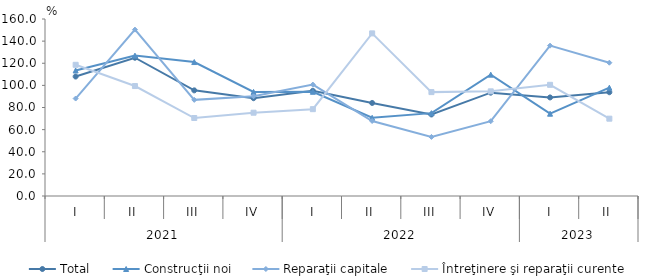
| Category | Total | Construcţii noi | Reparaţii capitale | Întreţinere şi reparaţii curente |
|---|---|---|---|---|
| 0 | 108 | 113.5 | 88.1 | 118.6 |
| 1 | 125 | 126.9 | 150.4 | 99.4 |
| 2 | 95.5 | 121.1 | 86.9 | 70.5 |
| 3 | 88.4 | 94.1 | 90.1 | 75.3 |
| 4 | 95.1 | 94.2 | 100.7 | 78.5 |
| 5 | 84.1 | 70.7 | 67.8 | 147 |
| 6 | 73.7 | 74.9 | 53.4 | 93.9 |
| 7 | 93.4 | 109.7 | 67.6 | 94.6 |
| 8 | 89.1 | 74.4 | 135.9 | 100.5 |
| 9 | 93.8 | 97.9 | 120.5 | 69.9 |